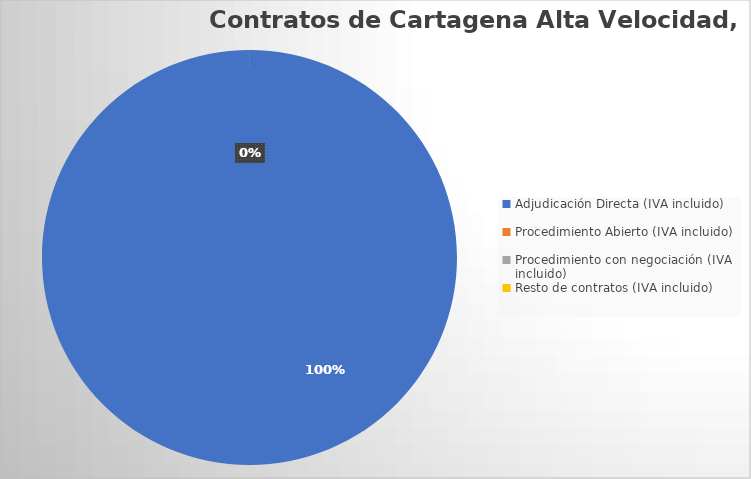
| Category |  Adjudicación Directa (IVA incluido)  |
|---|---|
| Adjudicación Directa (IVA incluido) | 3194.4 |
| Procedimiento Abierto (IVA incluido) | 0 |
| Procedimiento con negociación (IVA incluido) | 0 |
| Resto de contratos (IVA incluido) | 0 |